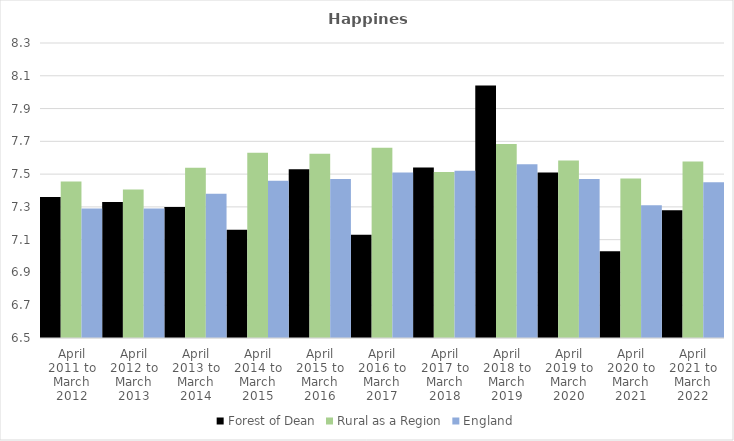
| Category | Forest of Dean | Rural as a Region | England |
|---|---|---|---|
| April 2011 to March 2012 | 7.36 | 7.454 | 7.29 |
| April 2012 to March 2013 | 7.33 | 7.406 | 7.29 |
| April 2013 to March 2014 | 7.3 | 7.539 | 7.38 |
| April 2014 to March 2015 | 7.16 | 7.63 | 7.46 |
| April 2015 to March 2016 | 7.53 | 7.625 | 7.47 |
| April 2016 to March 2017 | 7.13 | 7.661 | 7.51 |
| April 2017 to March 2018 | 7.54 | 7.513 | 7.52 |
| April 2018 to March 2019 | 8.04 | 7.684 | 7.56 |
| April 2019 to March 2020 | 7.51 | 7.582 | 7.47 |
| April 2020 to March 2021 | 7.03 | 7.474 | 7.31 |
| April 2021 to March 2022 | 7.28 | 7.577 | 7.45 |